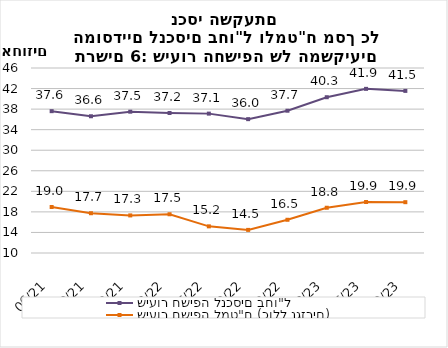
| Category | שיעור חשיפה לנכסים בחו"ל | שיעור חשיפה למט"ח (כולל נגזרים) |
|---|---|---|
| 2021-06-30 | 37.601 | 18.953 |
| 2021-09-30 | 36.61 | 17.74 |
| 2021-12-31 | 37.497 | 17.314 |
| 2022-03-31 | 37.241 | 17.538 |
| 2022-06-30 | 37.122 | 15.186 |
| 2022-09-30 | 36.045 | 14.495 |
| 2022-12-31 | 37.687 | 16.465 |
| 2023-03-31 | 40.315 | 18.806 |
| 2023-06-30 | 41.942 | 19.926 |
| 2023-09-30 | 41.546 | 19.891 |